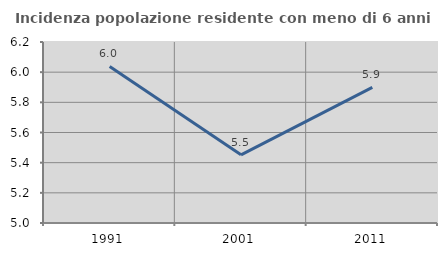
| Category | Incidenza popolazione residente con meno di 6 anni |
|---|---|
| 1991.0 | 6.038 |
| 2001.0 | 5.452 |
| 2011.0 | 5.899 |